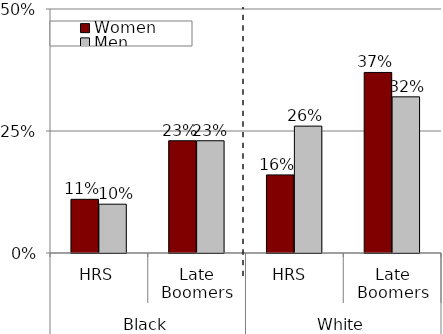
| Category | Women | Men |
|---|---|---|
| 0 | 0.11 | 0.1 |
| 1 | 0.23 | 0.23 |
| 2 | 0.16 | 0.26 |
| 3 | 0.37 | 0.32 |